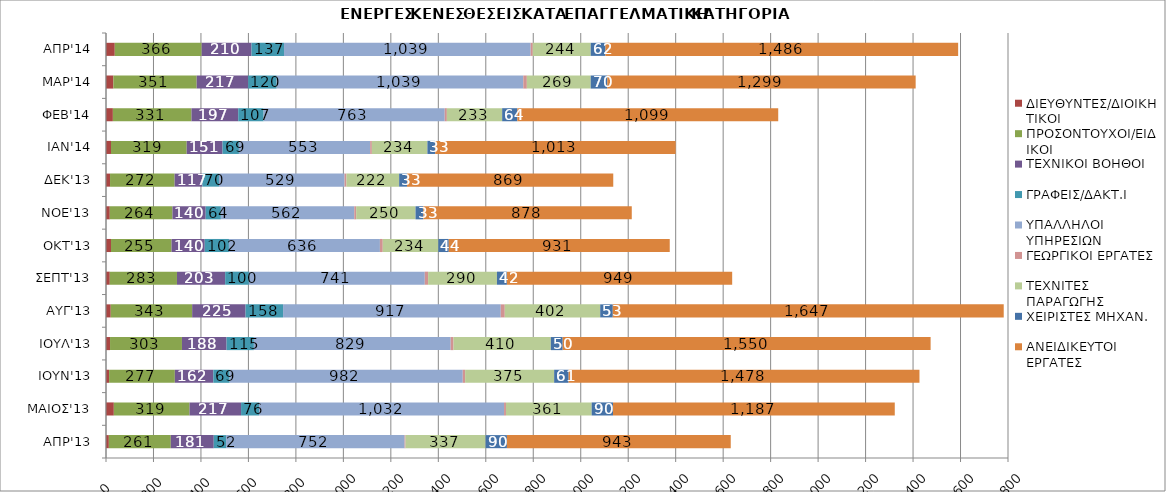
| Category | ΔΙΕΥΘΥΝΤΕΣ/ΔΙΟΙΚΗΤΙΚΟΙ | ΠΡΟΣΟΝΤΟΥΧΟΙ/ΕΙΔΙΚΟΙ | ΤΕΧΝΙΚΟΙ ΒΟΗΘΟΙ | ΓΡΑΦΕΙΣ/ΔΑΚΤ.Ι | ΥΠΑΛΛΗΛΟΙ ΥΠΗΡΕΣΙΩΝ | ΓΕΩΡΓΙΚΟΙ ΕΡΓΑΤΕΣ | ΤΕΧΝΙΤΕΣ ΠΑΡΑΓΩΓΗΣ | ΧΕΙΡΙΣΤΕΣ ΜΗΧΑΝ. | ΑΝΕΙΔΙΚΕΥΤΟΙ ΕΡΓΑΤΕΣ |
|---|---|---|---|---|---|---|---|---|---|
| ΑΠΡ'13 | 12 | 261 | 181 | 52 | 752 | 4 | 337 | 90 | 943 |
| ΜΑΙΟΣ'13 | 33 | 319 | 217 | 76 | 1032 | 8 | 361 | 90 | 1187 |
| ΙΟΥΝ'13 | 13 | 277 | 162 | 69 | 982 | 10 | 375 | 61 | 1478 |
| ΙΟΥΛ'13 | 17 | 303 | 188 | 115 | 829 | 12 | 410 | 50 | 1550 |
| ΑΥΓ'13 | 20 | 343 | 225 | 158 | 917 | 17 | 402 | 53 | 1647 |
| ΣΕΠΤ'13 | 16 | 283 | 203 | 100 | 741 | 14 | 290 | 42 | 949 |
| ΟΚΤ'13 | 21 | 255 | 140 | 102 | 636 | 12 | 234 | 44 | 931 |
| NOE'13 | 16 | 264 | 140 | 64 | 562 | 8 | 250 | 33 | 878 |
| ΔΕΚ'13 | 17 | 272 | 117 | 70 | 529 | 8 | 222 | 33 | 869 |
| IAN'14 | 21 | 319 | 151 | 69 | 553 | 7 | 234 | 33 | 1013 |
| ΦΕΒ'14 | 29 | 331 | 197 | 107 | 763 | 9 | 233 | 64 | 1099 |
| ΜΑΡ'14 | 31 | 351 | 217 | 120 | 1039 | 15 | 269 | 70 | 1299 |
| ΑΠΡ'14 | 37 | 366 | 210 | 137 | 1039 | 9 | 244 | 62 | 1486 |